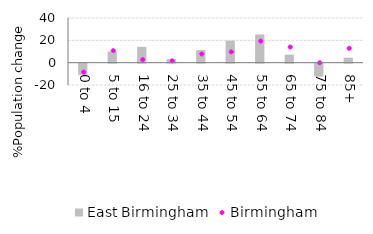
| Category | East Birmingham |
|---|---|
| 0 to 4 | -10.031 |
| 5 to 15 | 9.913 |
| 16 to 24 | 14.144 |
| 25 to 34 | 3.043 |
| 35 to 44 | 11.214 |
| 45 to 54 | 19.69 |
| 55 to 64 | 25.283 |
| 65 to 74 | 7.163 |
| 75 to 84 | -11.601 |
| 85+ | 4.476 |